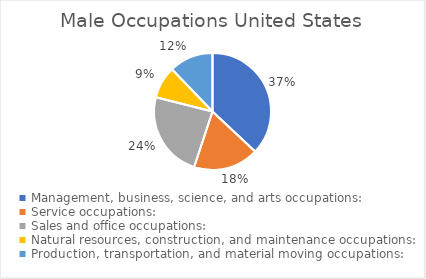
| Category | Series 0 | Series 1 |
|---|---|---|
| Management, business, science, and arts occupations: | 54751318 | 26076937 |
| Service occupations: | 26765182 | 11671822 |
| Sales and office occupations: | 35282759 | 13390245 |
| Natural resources, construction, and maintenance occupations: | 13171632 | 12557783 |
| Production, transportation, and material moving occupations: | 18030435 | 14035804 |